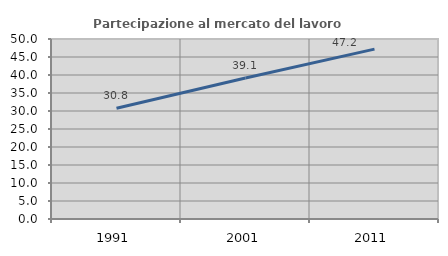
| Category | Partecipazione al mercato del lavoro  femminile |
|---|---|
| 1991.0 | 30.765 |
| 2001.0 | 39.145 |
| 2011.0 | 47.183 |